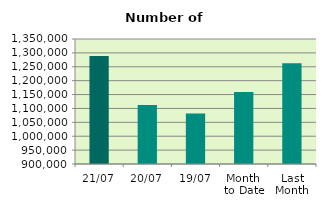
| Category | Series 0 |
|---|---|
| 21/07 | 1288816 |
| 20/07 | 1112758 |
| 19/07 | 1081980 |
| Month 
to Date | 1159190 |
| Last
Month | 1263143.455 |